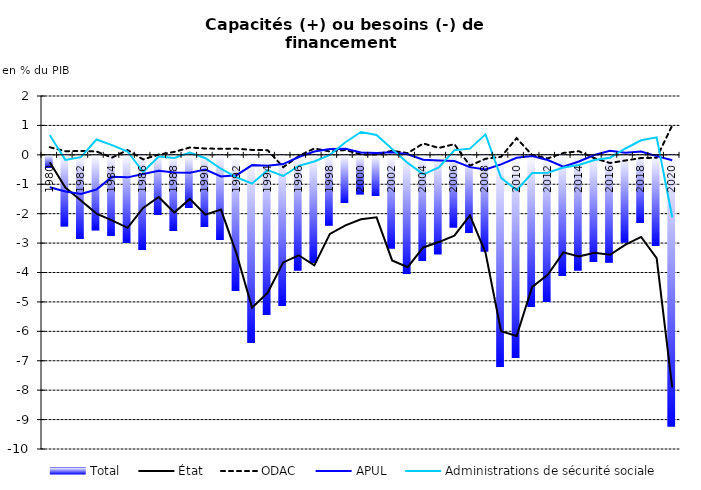
| Category | Total |
|---|---|
| 1980.0 | -0.429 |
| 1981.0 | -2.408 |
| 1982.0 | -2.837 |
| 1983.0 | -2.541 |
| 1984.0 | -2.736 |
| 1985.0 | -2.972 |
| 1986.0 | -3.197 |
| 1987.0 | -2.014 |
| 1988.0 | -2.564 |
| 1989.0 | -1.782 |
| 1990.0 | -2.434 |
| 1991.0 | -2.863 |
| 1992.0 | -4.601 |
| 1993.0 | -6.359 |
| 1994.0 | -5.423 |
| 1995.0 | -5.109 |
| 1996.0 | -3.906 |
| 1997.0 | -3.653 |
| 1998.0 | -2.379 |
| 1999.0 | -1.603 |
| 2000.0 | -1.318 |
| 2001.0 | -1.379 |
| 2002.0 | -3.16 |
| 2003.0 | -4.015 |
| 2004.0 | -3.591 |
| 2005.0 | -3.356 |
| 2006.0 | -2.444 |
| 2007.0 | -2.636 |
| 2008.0 | -3.264 |
| 2009.0 | -7.175 |
| 2010.0 | -6.887 |
| 2011.0 | -5.155 |
| 2012.0 | -4.981 |
| 2013.0 | -4.084 |
| 2014.0 | -3.905 |
| 2015.0 | -3.625 |
| 2016.0 | -3.637 |
| 2017.0 | -2.958 |
| 2018.0 | -2.289 |
| 2019.0 | -3.065 |
| 2020.0 | -9.206 |